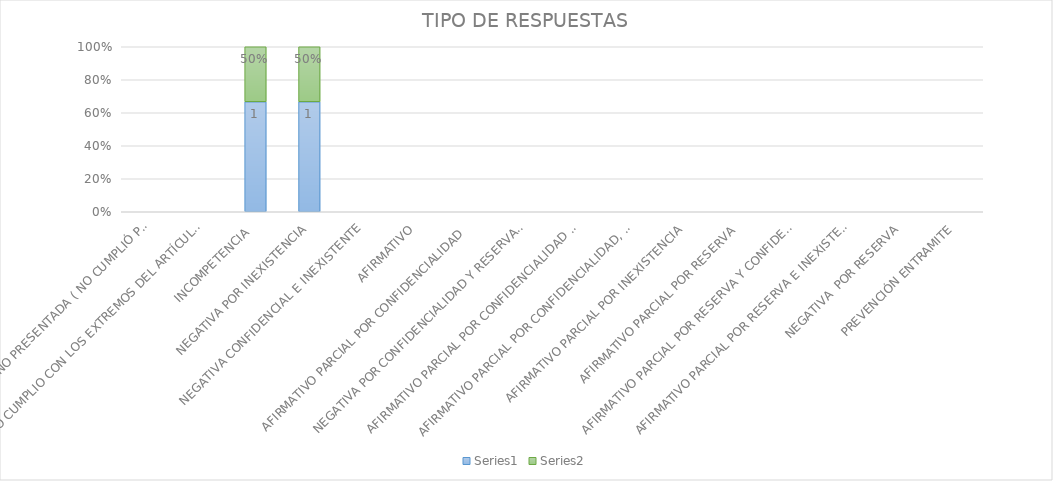
| Category | Series 4 | Series 5 |
|---|---|---|
| SE TIENE POR NO PRESENTADA ( NO CUMPLIÓ PREVENCIÓN) | 0 | 0 |
| NO CUMPLIO CON LOS EXTREMOS DEL ARTÍCULO 79 (REQUISITOS) | 0 | 0 |
| INCOMPETENCIA  | 1 | 0.5 |
| NEGATIVA POR INEXISTENCIA | 1 | 0.5 |
| NEGATIVA CONFIDENCIAL E INEXISTENTE | 0 | 0 |
| AFIRMATIVO | 0 | 0 |
| AFIRMATIVO PARCIAL POR CONFIDENCIALIDAD  | 0 | 0 |
| NEGATIVA POR CONFIDENCIALIDAD Y RESERVADA | 0 | 0 |
| AFIRMATIVO PARCIAL POR CONFIDENCIALIDAD E INEXISTENCIA | 0 | 0 |
| AFIRMATIVO PARCIAL POR CONFIDENCIALIDAD, RESERVA E INEXISTENCIA | 0 | 0 |
| AFIRMATIVO PARCIAL POR INEXISTENCIA | 0 | 0 |
| AFIRMATIVO PARCIAL POR RESERVA | 0 | 0 |
| AFIRMATIVO PARCIAL POR RESERVA Y CONFIDENCIALIDAD | 0 | 0 |
| AFIRMATIVO PARCIAL POR RESERVA E INEXISTENCIA | 0 | 0 |
| NEGATIVA  POR RESERVA | 0 | 0 |
| PREVENCIÓN ENTRAMITE | 0 | 0 |